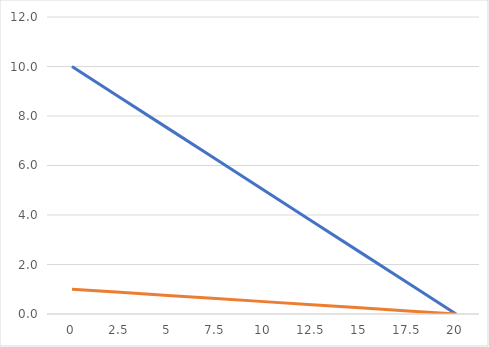
| Category | Inglaterra | POrtugal |
|---|---|---|
| 0.0 | 10 | 1 |
| 2.5 | 8.75 | 0.875 |
| 5.0 | 7.5 | 0.75 |
| 7.5 | 6.25 | 0.625 |
| 10.0 | 5 | 0.5 |
| 12.5 | 3.75 | 0.375 |
| 15.0 | 2.5 | 0.25 |
| 17.5 | 1.25 | 0.125 |
| 20.0 | 0 | 0 |